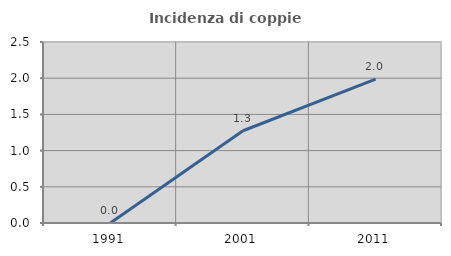
| Category | Incidenza di coppie miste |
|---|---|
| 1991.0 | 0 |
| 2001.0 | 1.274 |
| 2011.0 | 1.987 |